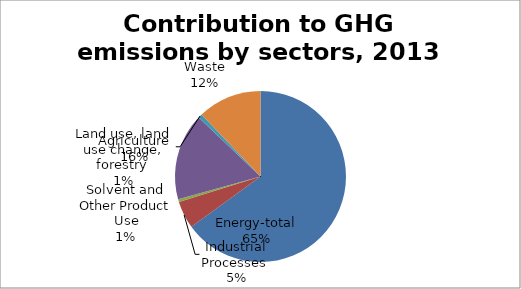
| Category | 8,4046 0,6726 0,0666 2,1267 -0,0976 1,5658 |
|---|---|
| Energy-total | 8.405 |
| Industrial Processes  | 0.673 |
| Solvent and Other Product Use | 0.067 |
| Agriculture | 2.127 |
| Land use, land use change, forestry  | -0.098 |
| Waste | 1.566 |